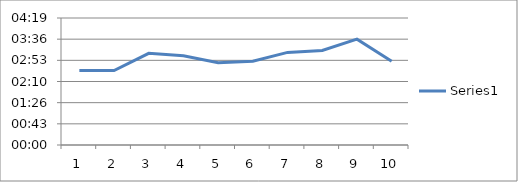
| Category | Series 0 |
|---|---|
| 0 | 0.002 |
| 1 | 0.002 |
| 2 | 0.002 |
| 3 | 0.002 |
| 4 | 0.002 |
| 5 | 0.002 |
| 6 | 0.002 |
| 7 | 0.002 |
| 8 | 0.002 |
| 9 | 0.002 |